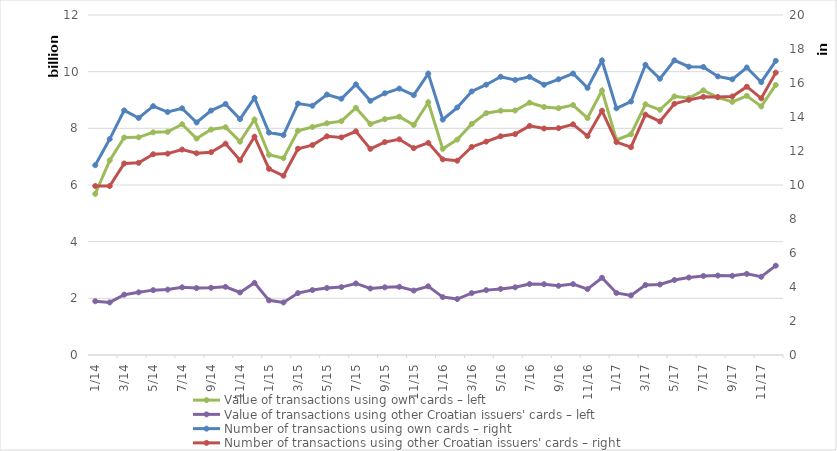
| Category | Value of transactions using own cards – left | Value of transactions using other Croatian issuers' cards – left |
|---|---|---|
| 2014-01-01 | 5687247363 | 1898593012 |
| 2014-02-01 | 6870063020 | 1855463907 |
| 2014-03-01 | 7674667102 | 2129994976 |
| 2014-04-01 | 7682026915 | 2212621583 |
| 2014-05-01 | 7858147469 | 2289145547 |
| 2014-06-01 | 7875143949 | 2308859849 |
| 2014-07-01 | 8145109619 | 2388536724 |
| 2014-08-01 | 7638237735 | 2362083538 |
| 2014-09-01 | 7957831033 | 2372481868 |
| 2014-10-01 | 8040341932 | 2406911162 |
| 2014-11-01 | 7528979185 | 2206276195 |
| 2014-12-01 | 8313079111 | 2546865094 |
| 2015-01-01 | 7064994843 | 1929030428 |
| 2015-02-01 | 6946593821 | 1853442353 |
| 2015-03-01 | 7912165174 | 2184893592 |
| 2015-04-01 | 8047410707 | 2291375278 |
| 2015-05-01 | 8177632963 | 2365055111 |
| 2015-06-01 | 8252429615 | 2396883379 |
| 2015-07-01 | 8723683467 | 2525158845 |
| 2015-08-01 | 8154008999 | 2348138964 |
| 2015-09-01 | 8324374117 | 2388891653 |
| 2015-10-01 | 8411020213 | 2408144476 |
| 2015-11-01 | 8119141285 | 2274247405 |
| 2015-12-01 | 8921936214 | 2423770136 |
| 2016-01-01 | 7274581698 | 2043165117 |
| 2016-02-01 | 7601069776 | 1975751262 |
| 2016-03-01 | 8154515803 | 2184810922 |
| 2016-04-01 | 8536006184 | 2289803134 |
| 2016-05-01 | 8622612405 | 2332785770 |
| 2016-06-01 | 8629034970 | 2389942571 |
| 2016-07-01 | 8904025504 | 2503371795 |
| 2016-08-01 | 8753008570 | 2499535388 |
| 2016-09-01 | 8709318074 | 2442949613 |
| 2016-10-01 | 8820702928 | 2502592179 |
| 2016-11-01 | 8362820758 | 2327194409 |
| 2016-12-01 | 9332637687 | 2726346925 |
| 2017-01-01 | 7591025836 | 2190190557 |
| 2017-02-01 | 7792091469 | 2102919551 |
| 2017-03-01 | 8848645928 | 2470655643 |
| 2017-04-01 | 8654763470 | 2490413036 |
| 2017-05-01 | 9126642889 | 2647280887 |
| 2017-06-01 | 9071446663 | 2734513423 |
| 2017-07-01 | 9341412109 | 2789614122 |
| 2017-08-01 | 9092498823 | 2803821568 |
| 2017-09-01 | 8934029593 | 2794823429 |
| 2017-10-01 | 9146073082 | 2863098138 |
| 2017-11-01 | 8773453563 | 2761213299 |
| 2017-12-01 | 9531190603 | 3152876747 |